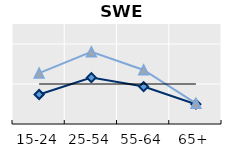
| Category | Foreign-born | Native-born | Series 1 |
|---|---|---|---|
| 15-24 | 0.737 | 1.271 | 1 |
| 25-54 | 1.159 | 1.803 | 1 |
| 55-64 | 0.936 | 1.351 | 1 |
| 65+ | 0.496 | 0.515 | 1 |